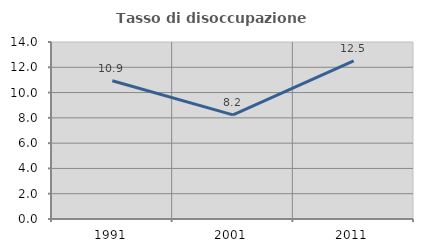
| Category | Tasso di disoccupazione giovanile  |
|---|---|
| 1991.0 | 10.938 |
| 2001.0 | 8.235 |
| 2011.0 | 12.5 |